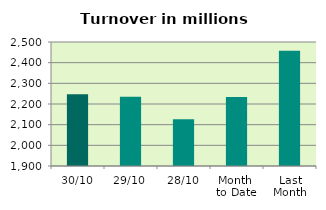
| Category | Series 0 |
|---|---|
| 30/10 | 2247.408 |
| 29/10 | 2234.958 |
| 28/10 | 2126.694 |
| Month 
to Date | 2233.822 |
| Last
Month | 2458.207 |